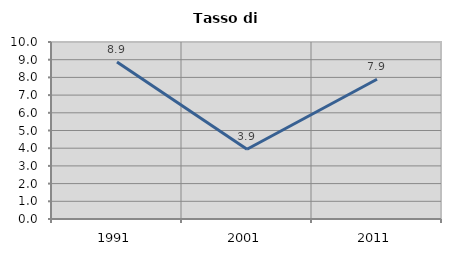
| Category | Tasso di disoccupazione   |
|---|---|
| 1991.0 | 8.869 |
| 2001.0 | 3.941 |
| 2011.0 | 7.893 |